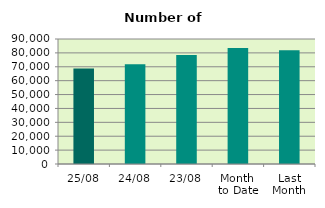
| Category | Series 0 |
|---|---|
| 25/08 | 68746 |
| 24/08 | 71868 |
| 23/08 | 78394 |
| Month 
to Date | 83574.105 |
| Last
Month | 81818 |